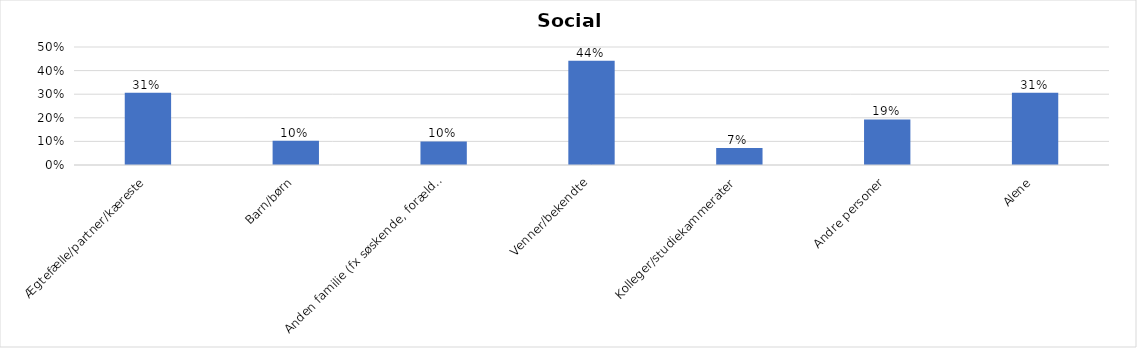
| Category | % |
|---|---|
| Ægtefælle/partner/kæreste | 0.306 |
| Barn/børn | 0.103 |
| Anden familie (fx søskende, forældre) | 0.1 |
| Venner/bekendte | 0.441 |
| Kolleger/studiekammerater | 0.072 |
| Andre personer | 0.193 |
| Alene | 0.306 |